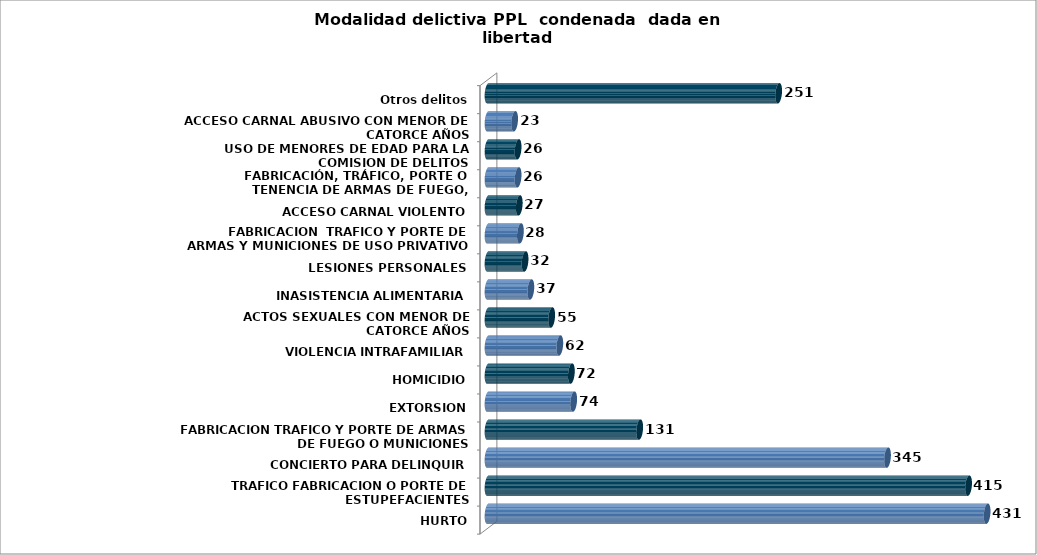
| Category | Series 0 |
|---|---|
| HURTO | 431 |
| TRAFICO FABRICACION O PORTE DE ESTUPEFACIENTES | 415 |
| CONCIERTO PARA DELINQUIR | 345 |
| FABRICACION TRAFICO Y PORTE DE ARMAS DE FUEGO O MUNICIONES | 131 |
| EXTORSION | 74 |
| HOMICIDIO | 72 |
| VIOLENCIA INTRAFAMILIAR | 62 |
| ACTOS SEXUALES CON MENOR DE CATORCE AÑOS | 55 |
| INASISTENCIA ALIMENTARIA | 37 |
| LESIONES PERSONALES | 32 |
| FABRICACION  TRAFICO Y PORTE DE ARMAS Y MUNICIONES DE USO PRIVATIVO DE LAS FUERZAS ARMADAS | 28 |
| ACCESO CARNAL VIOLENTO | 27 |
| FABRICACIÓN, TRÁFICO, PORTE O TENENCIA DE ARMAS DE FUEGO, ACCESORIOS, PARTES O MUNICIONES | 26 |
| USO DE MENORES DE EDAD PARA LA COMISION DE DELITOS | 26 |
| ACCESO CARNAL ABUSIVO CON MENOR DE CATORCE AÑOS | 23 |
| Otros delitos | 251 |